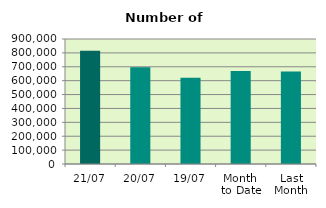
| Category | Series 0 |
|---|---|
| 21/07 | 815396 |
| 20/07 | 695758 |
| 19/07 | 621594 |
| Month 
to Date | 669705.067 |
| Last
Month | 666251.273 |